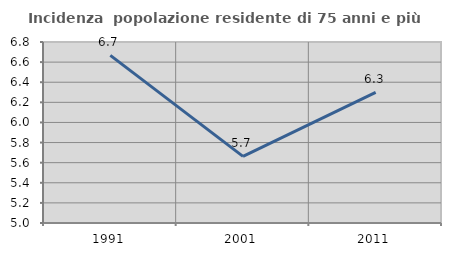
| Category | Incidenza  popolazione residente di 75 anni e più |
|---|---|
| 1991.0 | 6.667 |
| 2001.0 | 5.663 |
| 2011.0 | 6.299 |